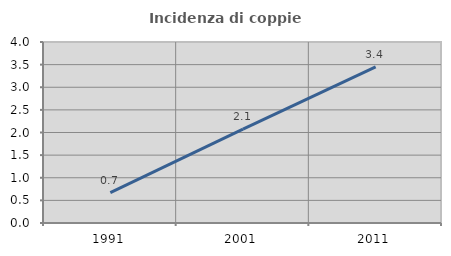
| Category | Incidenza di coppie miste |
|---|---|
| 1991.0 | 0.67 |
| 2001.0 | 2.073 |
| 2011.0 | 3.449 |